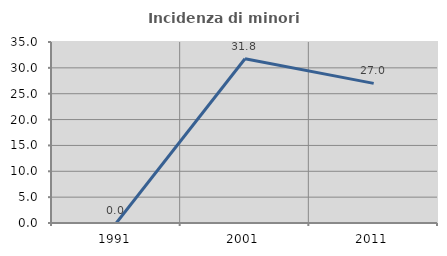
| Category | Incidenza di minori stranieri |
|---|---|
| 1991.0 | 0 |
| 2001.0 | 31.757 |
| 2011.0 | 27.004 |